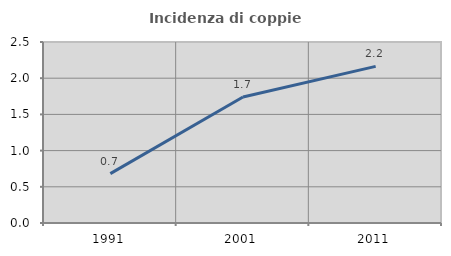
| Category | Incidenza di coppie miste |
|---|---|
| 1991.0 | 0.683 |
| 2001.0 | 1.74 |
| 2011.0 | 2.163 |